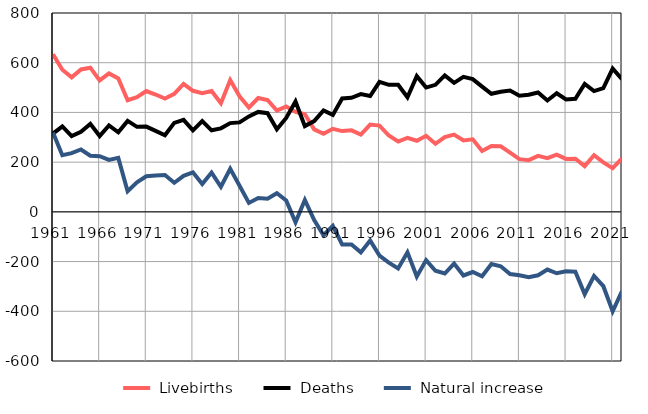
| Category |  Livebirths |  Deaths |  Natural increase |
|---|---|---|---|
| 1961.0 | 634 | 315 | 319 |
| 1962.0 | 572 | 344 | 228 |
| 1963.0 | 541 | 305 | 236 |
| 1964.0 | 573 | 322 | 251 |
| 1965.0 | 580 | 354 | 226 |
| 1966.0 | 529 | 305 | 224 |
| 1967.0 | 557 | 348 | 209 |
| 1968.0 | 537 | 320 | 217 |
| 1969.0 | 449 | 366 | 83 |
| 1970.0 | 461 | 342 | 119 |
| 1971.0 | 486 | 343 | 143 |
| 1972.0 | 472 | 326 | 146 |
| 1973.0 | 456 | 308 | 148 |
| 1974.0 | 475 | 358 | 117 |
| 1975.0 | 515 | 370 | 145 |
| 1976.0 | 487 | 328 | 159 |
| 1977.0 | 477 | 365 | 112 |
| 1978.0 | 486 | 328 | 158 |
| 1979.0 | 437 | 336 | 101 |
| 1980.0 | 530 | 357 | 173 |
| 1981.0 | 465 | 360 | 105 |
| 1982.0 | 420 | 384 | 36 |
| 1983.0 | 458 | 402 | 56 |
| 1984.0 | 450 | 397 | 53 |
| 1985.0 | 407 | 332 | 75 |
| 1986.0 | 424 | 378 | 46 |
| 1987.0 | 402 | 444 | -42 |
| 1988.0 | 393 | 345 | 48 |
| 1989.0 | 332 | 365 | -33 |
| 1990.0 | 314 | 408 | -94 |
| 1991.0 | 334 | 390 | -56 |
| 1992.0 | 325 | 456 | -131 |
| 1993.0 | 328 | 459 | -131 |
| 1994.0 | 311 | 474 | -163 |
| 1995.0 | 351 | 466 | -115 |
| 1996.0 | 347 | 523 | -176 |
| 1997.0 | 307 | 511 | -204 |
| 1998.0 | 283 | 511 | -228 |
| 1999.0 | 298 | 461 | -163 |
| 2000.0 | 286 | 546 | -260 |
| 2001.0 | 306 | 500 | -194 |
| 2002.0 | 274 | 511 | -237 |
| 2003.0 | 301 | 549 | -248 |
| 2004.0 | 311 | 519 | -208 |
| 2005.0 | 287 | 543 | -256 |
| 2006.0 | 292 | 534 | -242 |
| 2007.0 | 245 | 504 | -259 |
| 2008.0 | 265 | 475 | -210 |
| 2009.0 | 264 | 483 | -219 |
| 2010.0 | 238 | 488 | -250 |
| 2011.0 | 212 | 467 | -255 |
| 2012.0 | 208 | 471 | -263 |
| 2013.0 | 225 | 480 | -255 |
| 2014.0 | 216 | 448 | -232 |
| 2015.0 | 230 | 477 | -247 |
| 2016.0 | 213 | 452 | -239 |
| 2017.0 | 214 | 455 | -241 |
| 2018.0 | 184 | 515 | -331 |
| 2019.0 | 228 | 486 | -258 |
| 2020.0 | 199 | 498 | -299 |
| 2021.0 | 176 | 576 | -400 |
| 2022.0 | 215 | 534 | -319 |